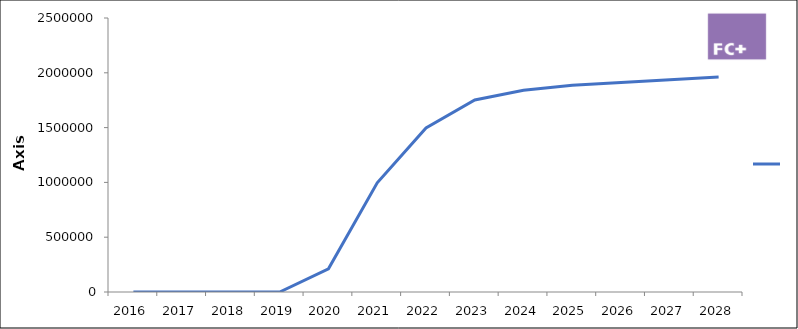
| Category | Product 4 |
|---|---|
| 2016 | 0 |
| 2017 | 0 |
| 2018 | 0 |
| 2019 | 0 |
| 2020 | 212030.965 |
| 2021 | 996514.01 |
| 2022 | 1495993.276 |
| 2023 | 1752543.706 |
| 2024 | 1839967.821 |
| 2025 | 1886309.329 |
| 2026 | 1911563.373 |
| 2027 | 1936817.417 |
| 2028 | 1962071.46 |